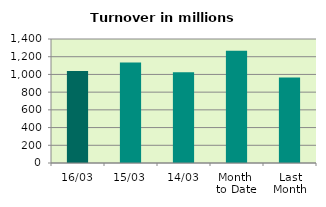
| Category | Series 0 |
|---|---|
| 16/03 | 1039.704 |
| 15/03 | 1133.555 |
| 14/03 | 1023.585 |
| Month 
to Date | 1268.032 |
| Last
Month | 966.674 |